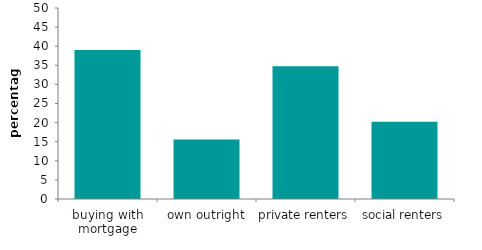
| Category | Series 0 |
|---|---|
| buying with mortgage | 39.009 |
| own outright | 15.598 |
| private renters | 34.764 |
| social renters | 20.21 |